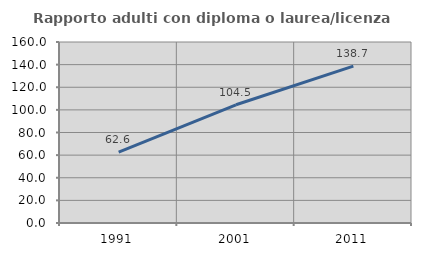
| Category | Rapporto adulti con diploma o laurea/licenza media  |
|---|---|
| 1991.0 | 62.637 |
| 2001.0 | 104.494 |
| 2011.0 | 138.699 |